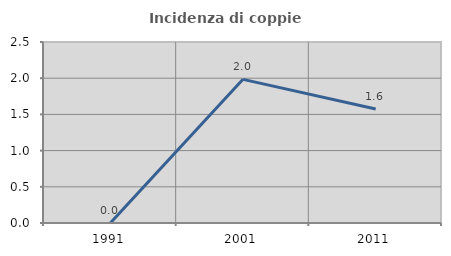
| Category | Incidenza di coppie miste |
|---|---|
| 1991.0 | 0 |
| 2001.0 | 1.984 |
| 2011.0 | 1.573 |